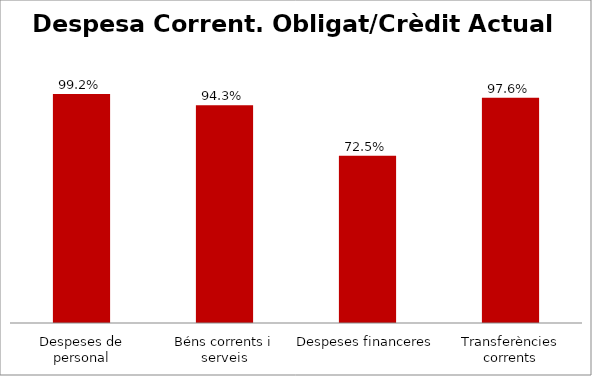
| Category | Series 0 |
|---|---|
| Despeses de personal | 0.992 |
| Béns corrents i serveis | 0.943 |
| Despeses financeres | 0.725 |
| Transferències corrents | 0.976 |